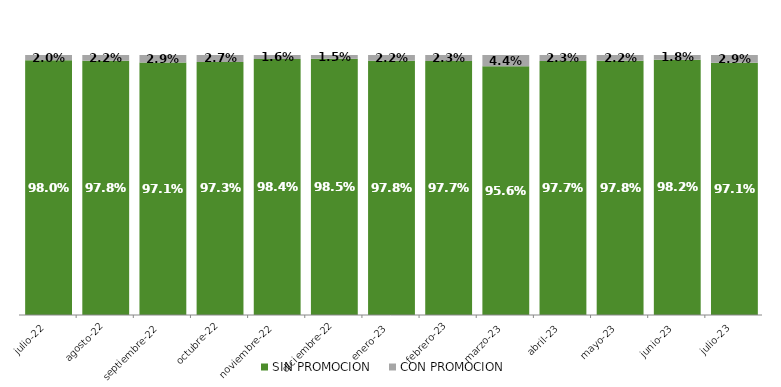
| Category | SIN PROMOCION   | CON PROMOCION   |
|---|---|---|
| 2022-07-01 | 0.98 | 0.02 |
| 2022-08-01 | 0.978 | 0.022 |
| 2022-09-01 | 0.971 | 0.029 |
| 2022-10-01 | 0.973 | 0.027 |
| 2022-11-01 | 0.984 | 0.016 |
| 2022-12-01 | 0.985 | 0.015 |
| 2023-01-01 | 0.978 | 0.022 |
| 2023-02-01 | 0.977 | 0.023 |
| 2023-03-01 | 0.956 | 0.044 |
| 2023-04-01 | 0.977 | 0.023 |
| 2023-05-01 | 0.978 | 0.022 |
| 2023-06-01 | 0.982 | 0.018 |
| 2023-07-01 | 0.971 | 0.029 |